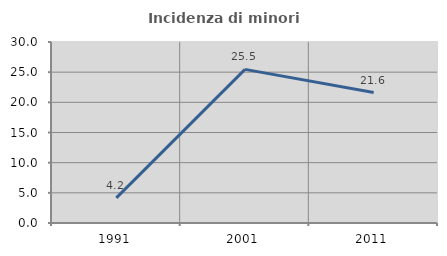
| Category | Incidenza di minori stranieri |
|---|---|
| 1991.0 | 4.167 |
| 2001.0 | 25.466 |
| 2011.0 | 21.628 |